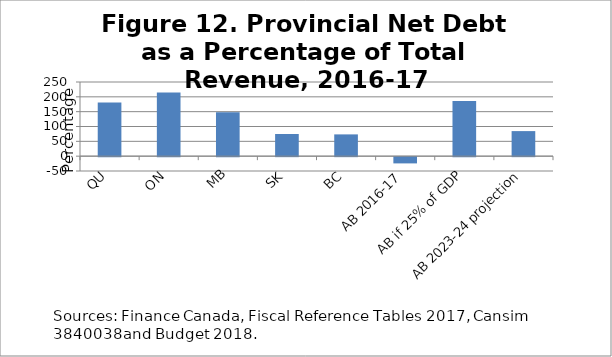
| Category | Net Debt as Percent of Total Revenue |
|---|---|
| QU | 180.8 |
| ON | 214.3 |
| MB | 147.7 |
| SK | 74.8 |
| BC | 73.4 |
| AB 2016-17 | -21 |
| AB if 25% of GDP | 185.7 |
| AB 2023-24 projection | 84.5 |